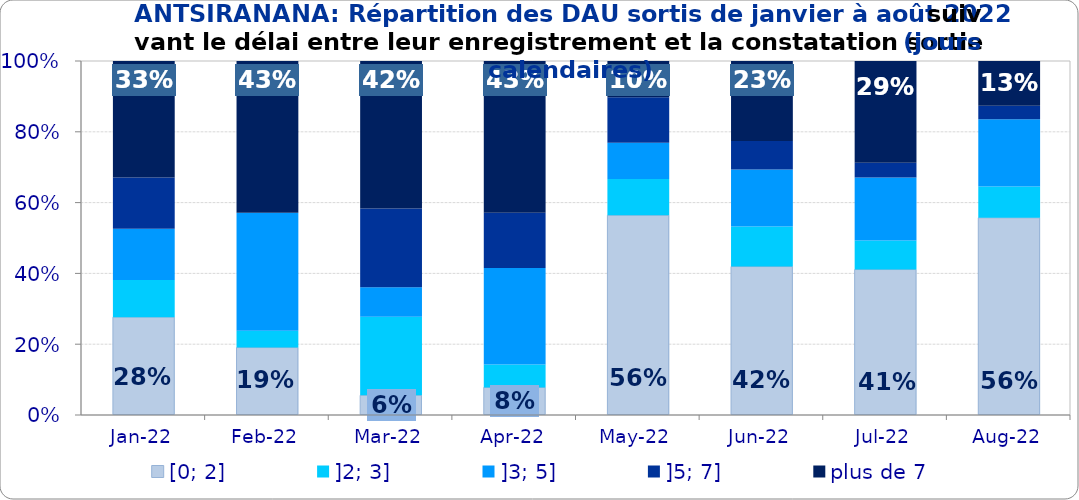
| Category | [0; 2] | ]2; 3] | ]3; 5] | ]5; 7] | plus de 7 |
|---|---|---|---|---|---|
| 2022-01-01 | 0.276 | 0.105 | 0.145 | 0.145 | 0.329 |
| 2022-02-01 | 0.19 | 0.048 | 0.333 | 0 | 0.429 |
| 2022-03-01 | 0.056 | 0.222 | 0.083 | 0.222 | 0.417 |
| 2022-04-01 | 0.078 | 0.065 | 0.273 | 0.156 | 0.429 |
| 2022-05-01 | 0.564 | 0.103 | 0.103 | 0.128 | 0.103 |
| 2022-06-01 | 0.419 | 0.113 | 0.161 | 0.081 | 0.226 |
| 2022-07-01 | 0.411 | 0.082 | 0.178 | 0.041 | 0.288 |
| 2022-08-01 | 0.557 | 0.089 | 0.19 | 0.038 | 0.127 |